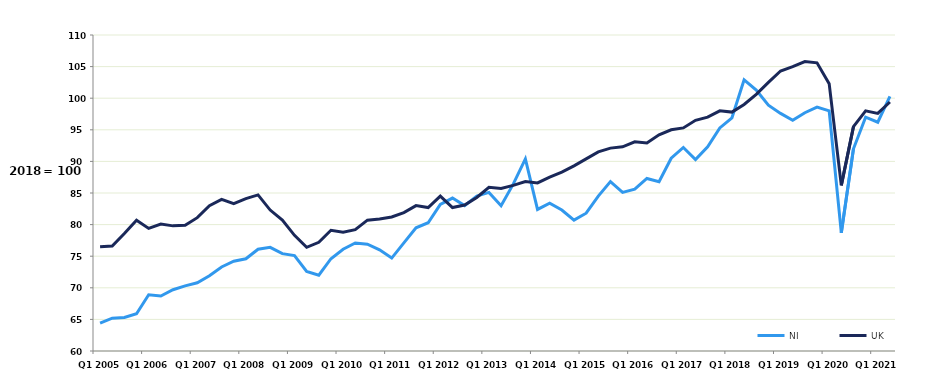
| Category | NI | UK |
|---|---|---|
| Q1 2005 | 64.4 | 76.5 |
|  | 65.2 | 76.6 |
|  | 65.3 | 78.6 |
|  | 65.9 | 80.7 |
| Q1 2006 | 68.9 | 79.4 |
|  | 68.7 | 80.1 |
|  | 69.7 | 79.8 |
|  | 70.3 | 79.9 |
| Q1 2007 | 70.8 | 81.1 |
|  | 71.9 | 83 |
|  | 73.3 | 84 |
|  | 74.2 | 83.3 |
| Q1 2008 | 74.6 | 84.1 |
|  | 76.1 | 84.7 |
|  | 76.4 | 82.3 |
|  | 75.4 | 80.7 |
| Q1 2009 | 75.1 | 78.3 |
|  | 72.6 | 76.4 |
|  | 72 | 77.2 |
|  | 74.6 | 79.1 |
| Q1 2010 | 76.1 | 78.8 |
|  | 77.1 | 79.2 |
|  | 76.9 | 80.7 |
|  | 76 | 80.9 |
| Q1 2011 | 74.7 | 81.2 |
|  | 77.1 | 81.9 |
|  | 79.5 | 83 |
|  | 80.3 | 82.7 |
| Q1 2012 | 83.2 | 84.5 |
|  | 84.2 | 82.7 |
|  | 83 | 83.1 |
|  | 84.5 | 84.3 |
| Q1 2013 | 85.1 | 85.9 |
|  | 83 | 85.7 |
|  | 86.4 | 86.2 |
|  | 90.4 | 86.8 |
| Q1 2014 | 82.4 | 86.6 |
|  | 83.4 | 87.5 |
|  | 82.3 | 88.3 |
|  | 80.7 | 89.3 |
| Q1 2015 | 81.8 | 90.4 |
|  | 84.5 | 91.5 |
|  | 86.8 | 92.1 |
|  | 85.1 | 92.3 |
| Q1 2016 | 85.6 | 93.1 |
|  | 87.3 | 92.9 |
|  | 86.8 | 94.2 |
|  | 90.5 | 95 |
| Q1 2017 | 92.2 | 95.3 |
|  | 90.3 | 96.5 |
|  | 92.3 | 97 |
|  | 95.3 | 98 |
| Q1 2018 | 96.9 | 97.8 |
|  | 102.9 | 99 |
|  | 101.3 | 100.6 |
|  | 98.9 | 102.5 |
| Q1 2019 | 97.6 | 104.3 |
|  | 96.5 | 105 |
|  | 97.7 | 105.8 |
|  | 98.6 | 105.6 |
| Q1 2020 | 98 | 102.3 |
|  | 78.7 | 86.2 |
|  | 92 | 95.5 |
|  | 97 | 98 |
| Q1 2021 | 96.2 | 97.6 |